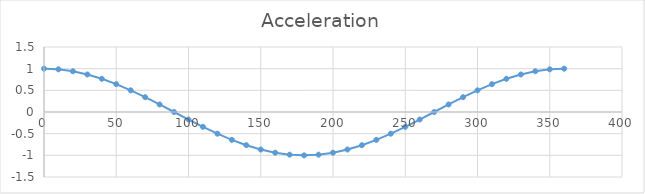
| Category | Series 0 |
|---|---|
| 0.0 | 1 |
| 10.0 | 0.985 |
| 20.0 | 0.94 |
| 30.0 | 0.866 |
| 40.0 | 0.766 |
| 50.0 | 0.643 |
| 60.0 | 0.5 |
| 70.0 | 0.342 |
| 80.0 | 0.174 |
| 90.0 | 0 |
| 100.0 | -0.174 |
| 110.0 | -0.342 |
| 120.0 | -0.5 |
| 130.0 | -0.643 |
| 140.0 | -0.766 |
| 150.0 | -0.866 |
| 160.0 | -0.94 |
| 170.0 | -0.985 |
| 180.0 | -1 |
| 190.0 | -0.985 |
| 200.0 | -0.94 |
| 210.0 | -0.866 |
| 220.0 | -0.766 |
| 230.0 | -0.643 |
| 240.0 | -0.5 |
| 250.0 | -0.342 |
| 260.0 | -0.174 |
| 270.0 | 0 |
| 280.0 | 0.174 |
| 290.0 | 0.342 |
| 300.0 | 0.5 |
| 310.0 | 0.643 |
| 320.0 | 0.766 |
| 330.0 | 0.866 |
| 340.0 | 0.94 |
| 350.0 | 0.985 |
| 360.0 | 1 |